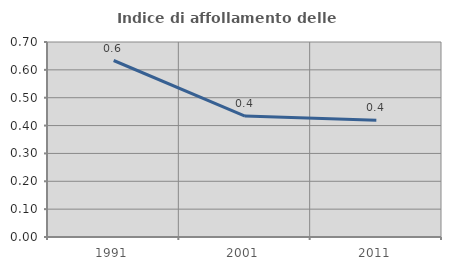
| Category | Indice di affollamento delle abitazioni  |
|---|---|
| 1991.0 | 0.634 |
| 2001.0 | 0.434 |
| 2011.0 | 0.419 |